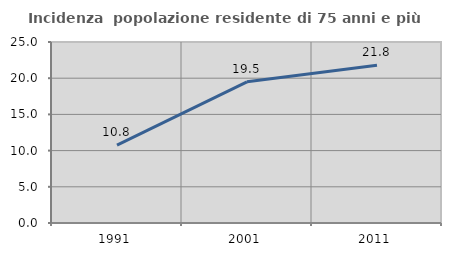
| Category | Incidenza  popolazione residente di 75 anni e più |
|---|---|
| 1991.0 | 10.769 |
| 2001.0 | 19.505 |
| 2011.0 | 21.779 |